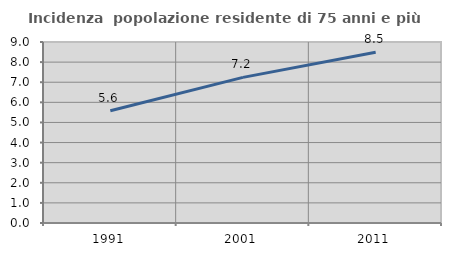
| Category | Incidenza  popolazione residente di 75 anni e più |
|---|---|
| 1991.0 | 5.584 |
| 2001.0 | 7.24 |
| 2011.0 | 8.486 |